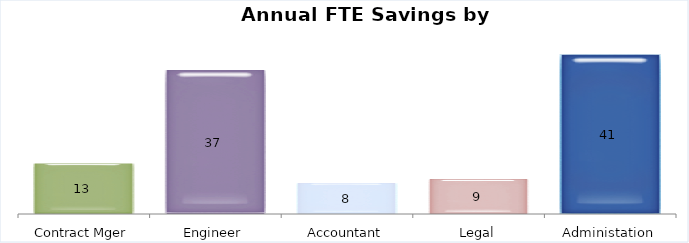
| Category | Series 0 |
|---|---|
| Contract Mger | 13 |
| Engineer | 37 |
| Accountant | 8 |
| Legal | 9 |
| Administation | 41 |